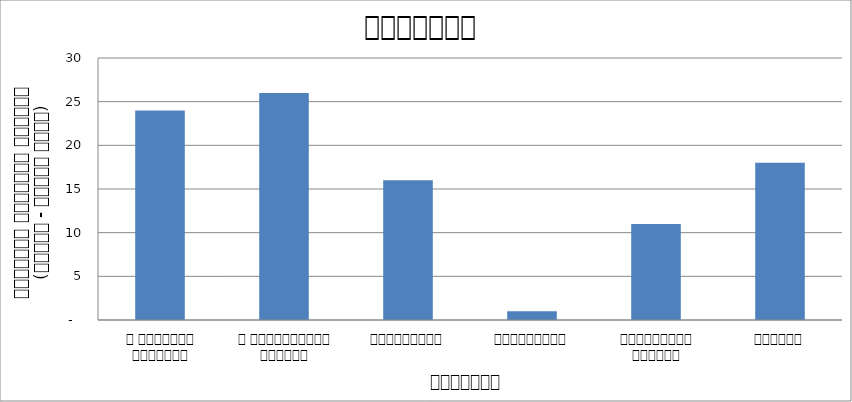
| Category | राजनीति |
|---|---|
| द हिमालयन टाइम्स् | 24 |
| द काठमाण्डौं पोस्ट् | 26 |
| रिपब्लिका | 16 |
| कान्तिपुर | 1 |
| अन्नपूर्ण पोस्ट् | 11 |
| नागरिक | 18 |